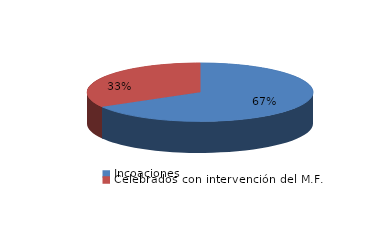
| Category | Series 0 |
|---|---|
| Incoaciones | 2576 |
| Celebrados con intervención del M.F. | 1289 |